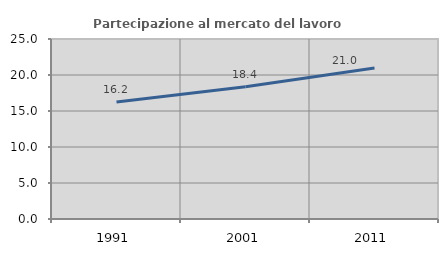
| Category | Partecipazione al mercato del lavoro  femminile |
|---|---|
| 1991.0 | 16.246 |
| 2001.0 | 18.382 |
| 2011.0 | 20.982 |